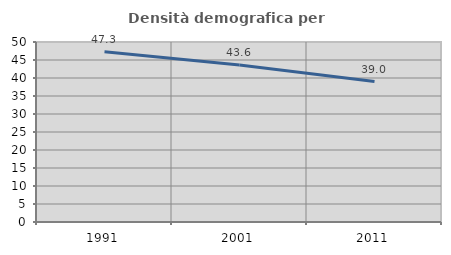
| Category | Densità demografica |
|---|---|
| 1991.0 | 47.281 |
| 2001.0 | 43.586 |
| 2011.0 | 39.02 |